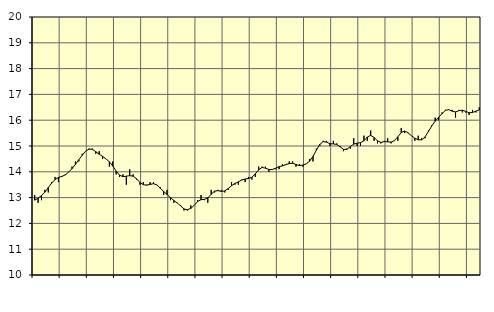
| Category | Piggar | Vård och omsorg, SNI 86-88 |
|---|---|---|
| nan | 13.1 | 12.9 |
| 87.0 | 12.8 | 12.98 |
| 87.0 | 12.9 | 13.08 |
| 87.0 | 13.3 | 13.21 |
| nan | 13.2 | 13.39 |
| 88.0 | 13.6 | 13.56 |
| 88.0 | 13.8 | 13.7 |
| 88.0 | 13.6 | 13.78 |
| nan | 13.8 | 13.82 |
| 89.0 | 13.9 | 13.88 |
| 89.0 | 14 | 13.99 |
| 89.0 | 14.2 | 14.12 |
| nan | 14.4 | 14.29 |
| 90.0 | 14.4 | 14.47 |
| 90.0 | 14.7 | 14.64 |
| 90.0 | 14.8 | 14.8 |
| nan | 14.9 | 14.88 |
| 91.0 | 14.9 | 14.87 |
| 91.0 | 14.7 | 14.78 |
| 91.0 | 14.8 | 14.68 |
| nan | 14.5 | 14.6 |
| 92.0 | 14.5 | 14.5 |
| 92.0 | 14.2 | 14.39 |
| 92.0 | 14.4 | 14.22 |
| nan | 13.9 | 14.03 |
| 93.0 | 13.8 | 13.87 |
| 93.0 | 13.9 | 13.81 |
| 93.0 | 13.5 | 13.83 |
| nan | 14.1 | 13.85 |
| 94.0 | 13.9 | 13.83 |
| 94.0 | 13.7 | 13.73 |
| 94.0 | 13.5 | 13.59 |
| nan | 13.6 | 13.5 |
| 95.0 | 13.5 | 13.48 |
| 95.0 | 13.6 | 13.51 |
| 95.0 | 13.6 | 13.54 |
| nan | 13.5 | 13.49 |
| 96.0 | 13.4 | 13.36 |
| 96.0 | 13.1 | 13.24 |
| 96.0 | 13.3 | 13.12 |
| nan | 12.9 | 13 |
| 97.0 | 12.8 | 12.89 |
| 97.0 | 12.8 | 12.79 |
| 97.0 | 12.7 | 12.68 |
| nan | 12.5 | 12.56 |
| 98.0 | 12.5 | 12.53 |
| 98.0 | 12.7 | 12.58 |
| 98.0 | 12.7 | 12.7 |
| nan | 12.9 | 12.85 |
| 99.0 | 13.1 | 12.92 |
| 99.0 | 12.9 | 12.93 |
| 99.0 | 12.8 | 12.99 |
| nan | 13.3 | 13.13 |
| 0.0 | 13.2 | 13.25 |
| 0.0 | 13.3 | 13.27 |
| 0.0 | 13.3 | 13.24 |
| nan | 13.2 | 13.26 |
| 1.0 | 13.3 | 13.35 |
| 1.0 | 13.6 | 13.46 |
| 1.0 | 13.5 | 13.55 |
| nan | 13.5 | 13.61 |
| 2.0 | 13.7 | 13.68 |
| 2.0 | 13.6 | 13.72 |
| 2.0 | 13.8 | 13.74 |
| nan | 13.7 | 13.79 |
| 3.0 | 13.8 | 13.92 |
| 3.0 | 14.2 | 14.08 |
| 3.0 | 14.2 | 14.17 |
| nan | 14.2 | 14.14 |
| 4.0 | 14 | 14.09 |
| 4.0 | 14.1 | 14.09 |
| 4.0 | 14.1 | 14.14 |
| nan | 14.1 | 14.2 |
| 5.0 | 14.3 | 14.23 |
| 5.0 | 14.3 | 14.28 |
| 5.0 | 14.4 | 14.32 |
| nan | 14.4 | 14.33 |
| 6.0 | 14.2 | 14.28 |
| 6.0 | 14.3 | 14.24 |
| 6.0 | 14.2 | 14.26 |
| nan | 14.3 | 14.31 |
| 7.0 | 14.5 | 14.41 |
| 7.0 | 14.4 | 14.6 |
| 7.0 | 14.9 | 14.84 |
| nan | 15 | 15.06 |
| 8.0 | 15.2 | 15.17 |
| 8.0 | 15.2 | 15.15 |
| 8.0 | 15 | 15.09 |
| nan | 15.2 | 15.08 |
| 9.0 | 15.1 | 15.06 |
| 9.0 | 15 | 14.97 |
| 9.0 | 14.8 | 14.87 |
| nan | 14.9 | 14.87 |
| 10.0 | 14.9 | 14.98 |
| 10.0 | 15.3 | 15.07 |
| 10.0 | 15 | 15.11 |
| nan | 15 | 15.13 |
| 11.0 | 15.4 | 15.2 |
| 11.0 | 15.2 | 15.35 |
| 11.0 | 15.6 | 15.41 |
| nan | 15.2 | 15.33 |
| 12.0 | 15.1 | 15.2 |
| 12.0 | 15.1 | 15.14 |
| 12.0 | 15.2 | 15.17 |
| nan | 15.3 | 15.16 |
| 13.0 | 15.1 | 15.15 |
| 13.0 | 15.2 | 15.21 |
| 13.0 | 15.2 | 15.36 |
| nan | 15.7 | 15.52 |
| 14.0 | 15.5 | 15.58 |
| 14.0 | 15.5 | 15.51 |
| 14.0 | 15.4 | 15.4 |
| nan | 15.2 | 15.3 |
| 15.0 | 15.4 | 15.24 |
| 15.0 | 15.3 | 15.24 |
| 15.0 | 15.3 | 15.35 |
| nan | 15.6 | 15.56 |
| 16.0 | 15.8 | 15.78 |
| 16.0 | 16.1 | 15.96 |
| 16.0 | 16 | 16.11 |
| nan | 16.3 | 16.25 |
| 17.0 | 16.4 | 16.38 |
| 17.0 | 16.4 | 16.41 |
| 17.0 | 16.4 | 16.35 |
| nan | 16.1 | 16.32 |
| 18.0 | 16.4 | 16.37 |
| 18.0 | 16.3 | 16.39 |
| 18.0 | 16.3 | 16.34 |
| nan | 16.2 | 16.29 |
| 19.0 | 16.4 | 16.3 |
| 19.0 | 16.3 | 16.35 |
| 19.0 | 16.5 | 16.4 |